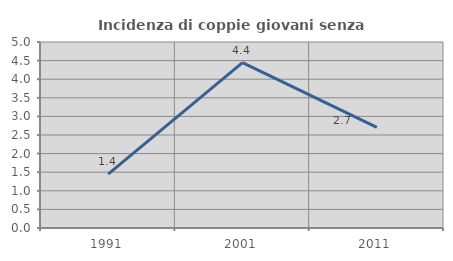
| Category | Incidenza di coppie giovani senza figli |
|---|---|
| 1991.0 | 1.449 |
| 2001.0 | 4.444 |
| 2011.0 | 2.703 |